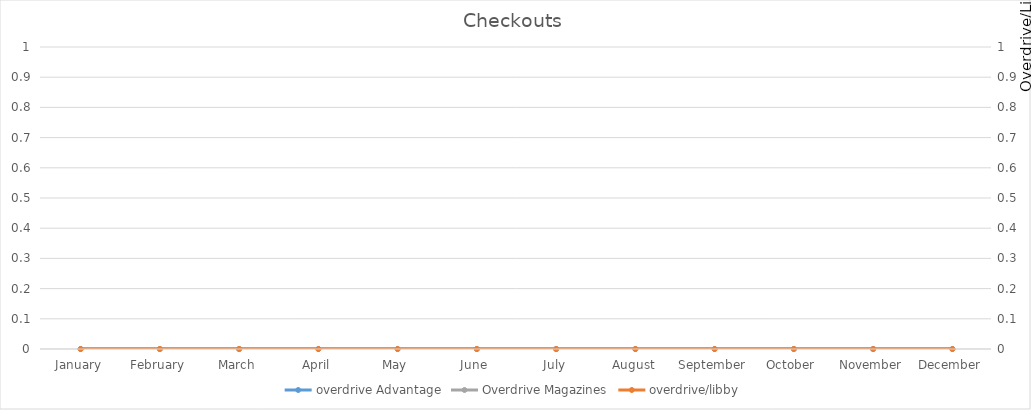
| Category | overdrive Advantage | Overdrive Magazines |
|---|---|---|
| 0 | 0 | 0 |
| 1 | 0 | 0 |
| 2 | 0 | 0 |
| 3 | 0 | 0 |
| 4 | 0 | 0 |
| 5 | 0 | 0 |
| 6 | 0 | 0 |
| 7 | 0 | 0 |
| 8 | 0 | 0 |
| 9 | 0 | 0 |
| 10 | 0 | 0 |
| 11 | 0 | 0 |